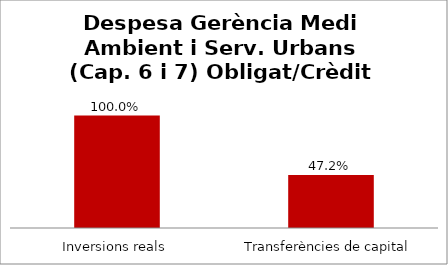
| Category | Series 0 |
|---|---|
| Inversions reals | 1 |
| Transferències de capital | 0.472 |